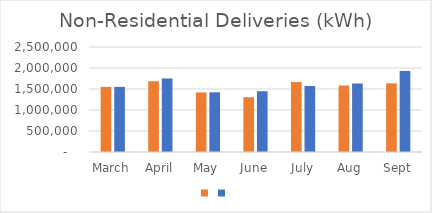
| Category | Series 1 | Series 0 |
|---|---|---|
| March | 1549153 | 1550355 |
| April | 1684677 | 1750598 |
| May | 1417925 | 1421957 |
| June | 1304116 | 1447306 |
| July | 1664865 | 1572197 |
| Aug | 1582276 | 1631031 |
| Sept | 1633351 | 1930305 |